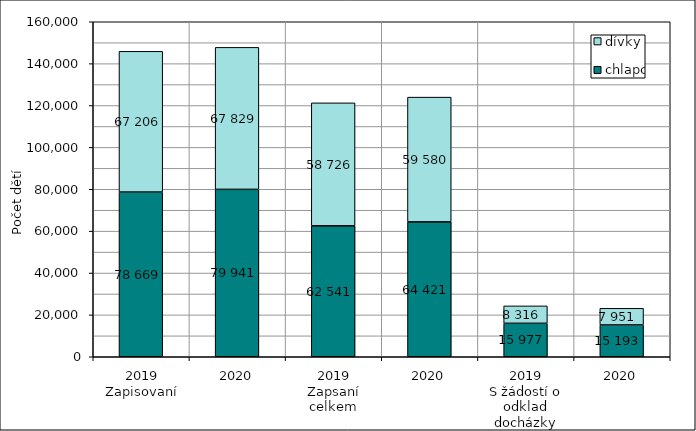
| Category | chlapci | dívky |
|---|---|---|
| 0 | 78669 | 67206 |
| 1 | 79941 | 67829 |
| 2 | 62541 | 58726 |
| 3 | 64421 | 59580 |
| 4 | 15977 | 8316 |
| 5 | 15193 | 7951 |